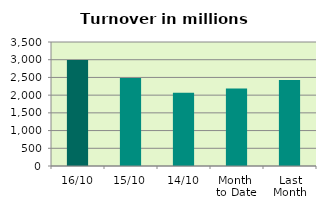
| Category | Series 0 |
|---|---|
| 16/10 | 2992.635 |
| 15/10 | 2484.322 |
| 14/10 | 2067.676 |
| Month 
to Date | 2184.015 |
| Last
Month | 2424.403 |